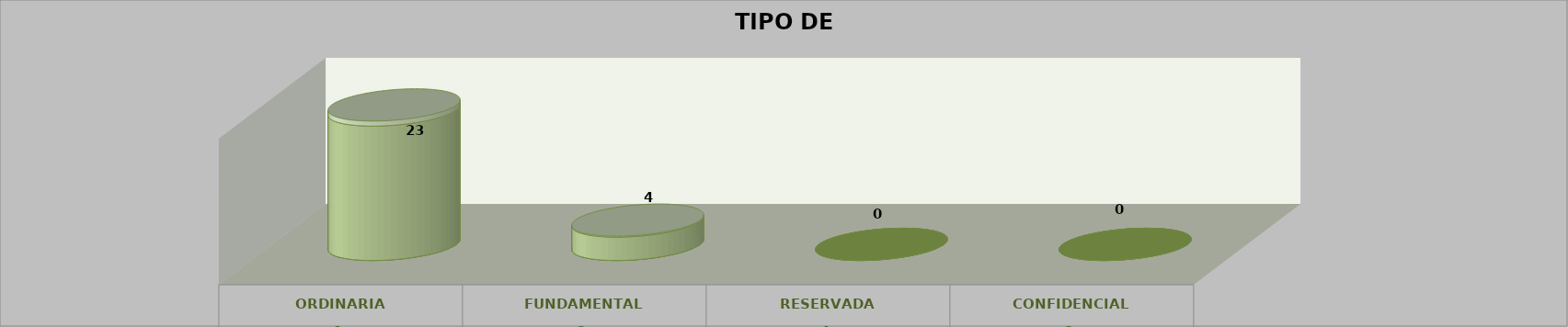
| Category | Series 0 | Series 2 | Series 1 | Series 3 | Series 4 |
|---|---|---|---|---|---|
| 0 |  |  |  | 23 | 0.852 |
| 1 |  |  |  | 4 | 0.148 |
| 2 |  |  |  | 0 | 0 |
| 3 |  |  |  | 0 | 0 |